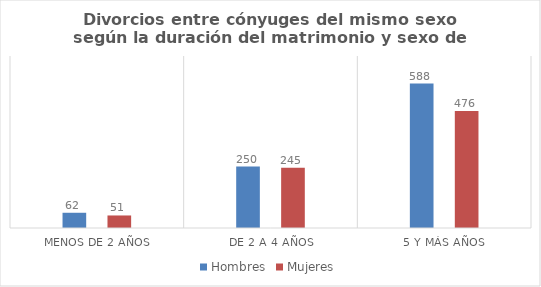
| Category | Hombres | Mujeres |
|---|---|---|
| Menos de 2 años | 62 | 51 |
| De 2 a 4 años | 250 | 245 |
| 5 y más años | 588 | 476 |